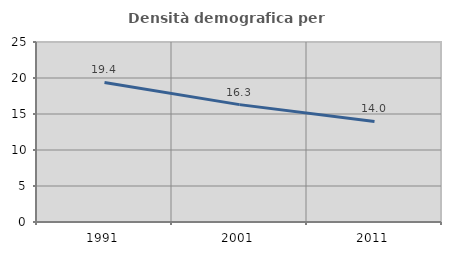
| Category | Densità demografica |
|---|---|
| 1991.0 | 19.385 |
| 2001.0 | 16.303 |
| 2011.0 | 13.967 |